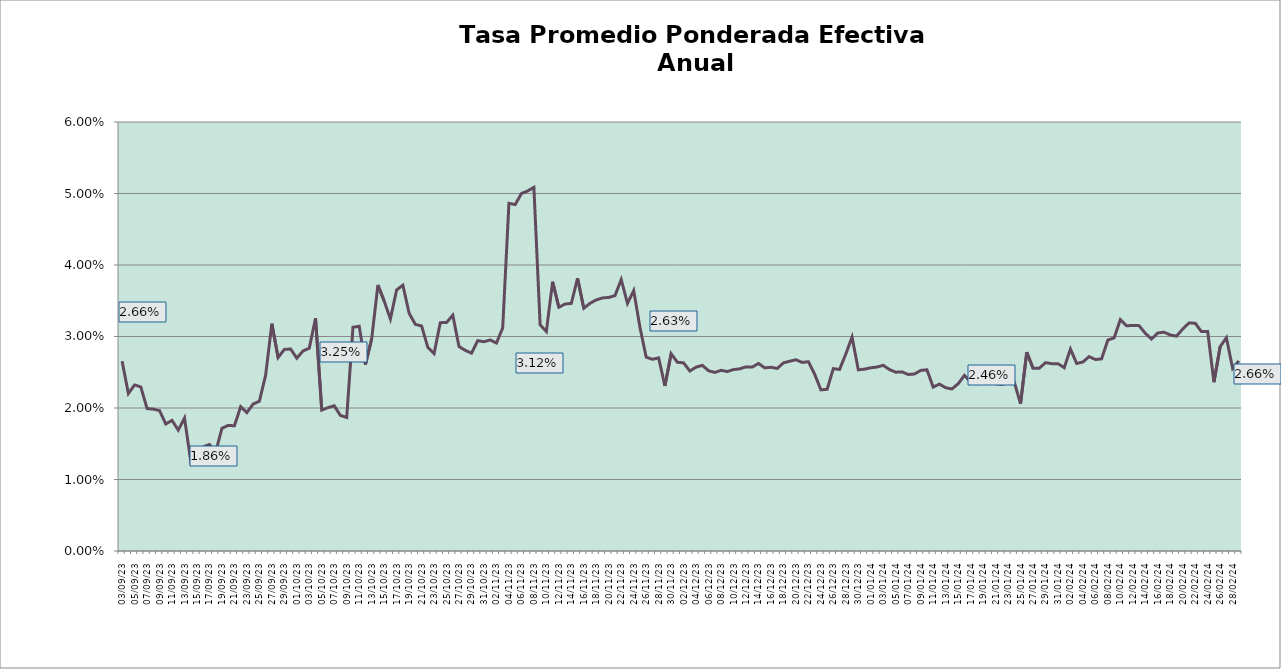
| Category | TEA |
|---|---|
| 2023-09-03 | 0.027 |
| 2023-09-04 | 0.022 |
| 2023-09-05 | 0.023 |
| 2023-09-06 | 0.023 |
| 2023-09-07 | 0.02 |
| 2023-09-08 | 0.02 |
| 2023-09-09 | 0.02 |
| 2023-09-10 | 0.018 |
| 2023-09-11 | 0.018 |
| 2023-09-12 | 0.017 |
| 2023-09-13 | 0.019 |
| 2023-09-14 | 0.013 |
| 2023-09-15 | 0.014 |
| 2023-09-16 | 0.015 |
| 2023-09-17 | 0.015 |
| 2023-09-18 | 0.014 |
| 2023-09-19 | 0.017 |
| 2023-09-20 | 0.018 |
| 2023-09-21 | 0.018 |
| 2023-09-22 | 0.02 |
| 2023-09-23 | 0.019 |
| 2023-09-24 | 0.021 |
| 2023-09-25 | 0.021 |
| 2023-09-26 | 0.025 |
| 2023-09-27 | 0.032 |
| 2023-09-28 | 0.027 |
| 2023-09-29 | 0.028 |
| 2023-09-30 | 0.028 |
| 2023-10-01 | 0.027 |
| 2023-10-02 | 0.028 |
| 2023-10-03 | 0.028 |
| 2023-10-04 | 0.033 |
| 2023-10-05 | 0.02 |
| 2023-10-06 | 0.02 |
| 2023-10-07 | 0.02 |
| 2023-10-08 | 0.019 |
| 2023-10-09 | 0.019 |
| 2023-10-10 | 0.031 |
| 2023-10-11 | 0.031 |
| 2023-10-12 | 0.026 |
| 2023-10-13 | 0.03 |
| 2023-10-14 | 0.037 |
| 2023-10-15 | 0.035 |
| 2023-10-16 | 0.032 |
| 2023-10-17 | 0.037 |
| 2023-10-18 | 0.037 |
| 2023-10-19 | 0.033 |
| 2023-10-20 | 0.032 |
| 2023-10-21 | 0.031 |
| 2023-10-22 | 0.028 |
| 2023-10-23 | 0.028 |
| 2023-10-24 | 0.032 |
| 2023-10-25 | 0.032 |
| 2023-10-26 | 0.033 |
| 2023-10-27 | 0.029 |
| 2023-10-28 | 0.028 |
| 2023-10-29 | 0.028 |
| 2023-10-30 | 0.029 |
| 2023-10-31 | 0.029 |
| 2023-11-01 | 0.03 |
| 2023-11-02 | 0.029 |
| 2023-11-03 | 0.031 |
| 2023-11-04 | 0.049 |
| 2023-11-05 | 0.048 |
| 2023-11-06 | 0.05 |
| 2023-11-07 | 0.05 |
| 2023-11-08 | 0.051 |
| 2023-11-09 | 0.032 |
| 2023-11-10 | 0.031 |
| 2023-11-11 | 0.038 |
| 2023-11-12 | 0.034 |
| 2023-11-13 | 0.035 |
| 2023-11-14 | 0.035 |
| 2023-11-15 | 0.038 |
| 2023-11-16 | 0.034 |
| 2023-11-17 | 0.035 |
| 2023-11-18 | 0.035 |
| 2023-11-19 | 0.035 |
| 2023-11-20 | 0.035 |
| 2023-11-21 | 0.036 |
| 2023-11-22 | 0.038 |
| 2023-11-23 | 0.035 |
| 2023-11-24 | 0.036 |
| 2023-11-25 | 0.031 |
| 2023-11-26 | 0.027 |
| 2023-11-27 | 0.027 |
| 2023-11-28 | 0.027 |
| 2023-11-29 | 0.023 |
| 2023-11-30 | 0.028 |
| 2023-12-01 | 0.026 |
| 2023-12-02 | 0.026 |
| 2023-12-03 | 0.025 |
| 2023-12-04 | 0.026 |
| 2023-12-05 | 0.026 |
| 2023-12-06 | 0.025 |
| 2023-12-07 | 0.025 |
| 2023-12-08 | 0.025 |
| 2023-12-09 | 0.025 |
| 2023-12-10 | 0.025 |
| 2023-12-11 | 0.025 |
| 2023-12-12 | 0.026 |
| 2023-12-13 | 0.026 |
| 2023-12-14 | 0.026 |
| 2023-12-15 | 0.026 |
| 2023-12-16 | 0.026 |
| 2023-12-17 | 0.026 |
| 2023-12-18 | 0.026 |
| 2023-12-19 | 0.027 |
| 2023-12-20 | 0.027 |
| 2023-12-21 | 0.026 |
| 2023-12-22 | 0.026 |
| 2023-12-23 | 0.025 |
| 2023-12-24 | 0.023 |
| 2023-12-25 | 0.023 |
| 2023-12-26 | 0.026 |
| 2023-12-27 | 0.025 |
| 2023-12-28 | 0.028 |
| 2023-12-29 | 0.03 |
| 2023-12-30 | 0.025 |
| 2023-12-31 | 0.025 |
| 2024-01-01 | 0.026 |
| 2024-01-02 | 0.026 |
| 2024-01-03 | 0.026 |
| 2024-01-04 | 0.025 |
| 2024-01-05 | 0.025 |
| 2024-01-06 | 0.025 |
| 2024-01-07 | 0.025 |
| 2024-01-08 | 0.025 |
| 2024-01-09 | 0.025 |
| 2024-01-10 | 0.025 |
| 2024-01-11 | 0.023 |
| 2024-01-12 | 0.023 |
| 2024-01-13 | 0.023 |
| 2024-01-14 | 0.023 |
| 2024-01-15 | 0.023 |
| 2024-01-16 | 0.025 |
| 2024-01-17 | 0.024 |
| 2024-01-18 | 0.023 |
| 2024-01-19 | 0.024 |
| 2024-01-20 | 0.024 |
| 2024-01-21 | 0.023 |
| 2024-01-22 | 0.023 |
| 2024-01-23 | 0.024 |
| 2024-01-24 | 0.024 |
| 2024-01-25 | 0.021 |
| 2024-01-26 | 0.028 |
| 2024-01-27 | 0.026 |
| 2024-01-28 | 0.026 |
| 2024-01-29 | 0.026 |
| 2024-01-30 | 0.026 |
| 2024-01-31 | 0.026 |
| 2024-02-01 | 0.026 |
| 2024-02-02 | 0.028 |
| 2024-02-03 | 0.026 |
| 2024-02-04 | 0.026 |
| 2024-02-05 | 0.027 |
| 2024-02-06 | 0.027 |
| 2024-02-07 | 0.027 |
| 2024-02-08 | 0.03 |
| 2024-02-09 | 0.03 |
| 2024-02-10 | 0.032 |
| 2024-02-11 | 0.031 |
| 2024-02-12 | 0.032 |
| 2024-02-13 | 0.032 |
| 2024-02-14 | 0.03 |
| 2024-02-15 | 0.03 |
| 2024-02-16 | 0.03 |
| 2024-02-17 | 0.031 |
| 2024-02-18 | 0.03 |
| 2024-02-19 | 0.03 |
| 2024-02-20 | 0.031 |
| 2024-02-21 | 0.032 |
| 2024-02-22 | 0.032 |
| 2024-02-23 | 0.031 |
| 2024-02-24 | 0.031 |
| 2024-02-25 | 0.024 |
| 2024-02-26 | 0.029 |
| 2024-02-27 | 0.03 |
| 2024-02-28 | 0.026 |
| 2024-02-29 | 0.027 |